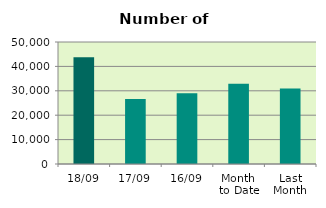
| Category | Series 0 |
|---|---|
| 18/09 | 43746 |
| 17/09 | 26624 |
| 16/09 | 28950 |
| Month 
to Date | 32882.714 |
| Last
Month | 30949.143 |